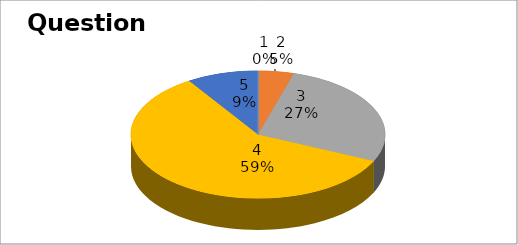
| Category | Series 0 |
|---|---|
| 0 | 0 |
| 1 | 1 |
| 2 | 6 |
| 3 | 13 |
| 4 | 2 |